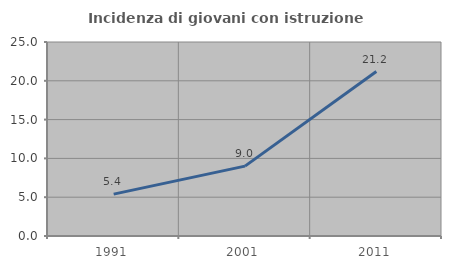
| Category | Incidenza di giovani con istruzione universitaria |
|---|---|
| 1991.0 | 5.392 |
| 2001.0 | 9.004 |
| 2011.0 | 21.195 |